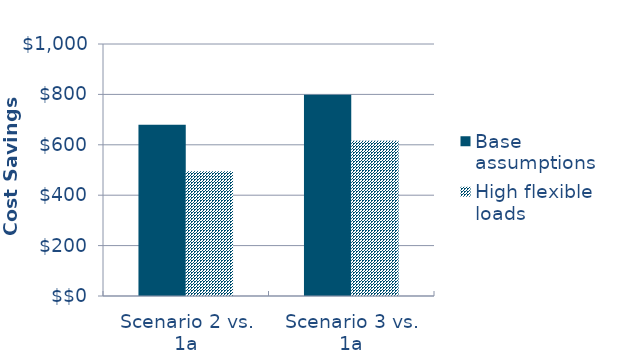
| Category | Base assumptions  | High flexible loads |
|---|---|---|
| Scenario 2 vs. 1a | -679.806 | -495.146 |
| Scenario 3 vs. 1a | -799.049 | -616.243 |